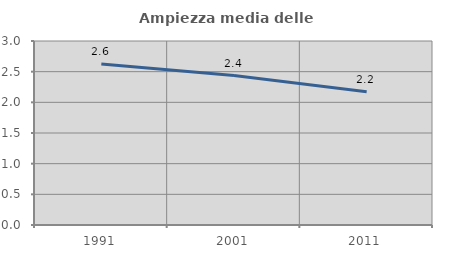
| Category | Ampiezza media delle famiglie |
|---|---|
| 1991.0 | 2.626 |
| 2001.0 | 2.436 |
| 2011.0 | 2.173 |